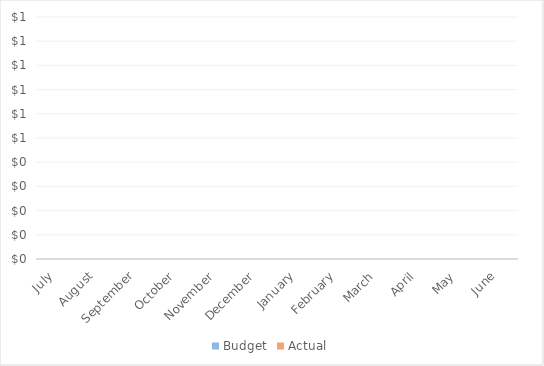
| Category | Budget | Actual |
|---|---|---|
| July | 0 | 0 |
| August | 0 | 0 |
| September | 0 | 0 |
| October | 0 | 0 |
| November | 0 | 0 |
| December | 0 | 0 |
| January | 0 | 0 |
| February | 0 | 0 |
| March | 0 | 0 |
| April | 0 | 0 |
| May | 0 | 0 |
| June | 0 | 0 |